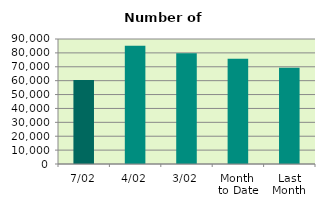
| Category | Series 0 |
|---|---|
| 7/02 | 60418 |
| 4/02 | 85084 |
| 3/02 | 79686 |
| Month 
to Date | 75781.6 |
| Last
Month | 69227.8 |